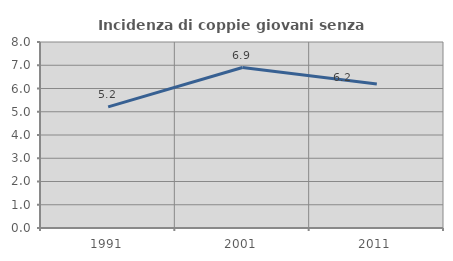
| Category | Incidenza di coppie giovani senza figli |
|---|---|
| 1991.0 | 5.209 |
| 2001.0 | 6.901 |
| 2011.0 | 6.192 |